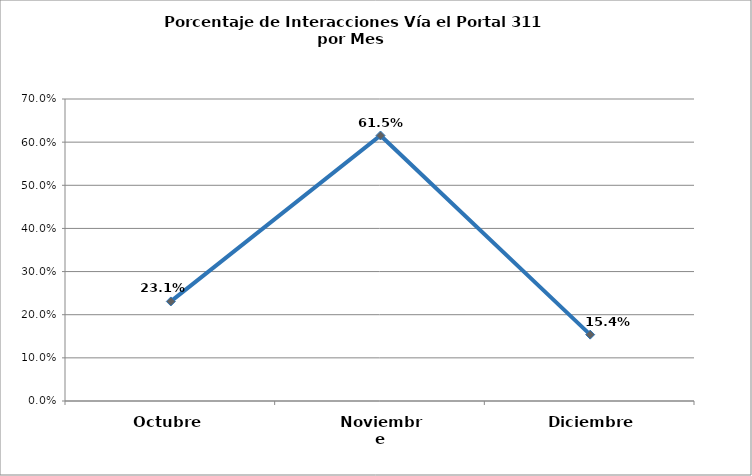
| Category | Series 0 |
|---|---|
| Octubre | 0.231 |
| Noviembre | 0.615 |
| Diciembre | 0.154 |